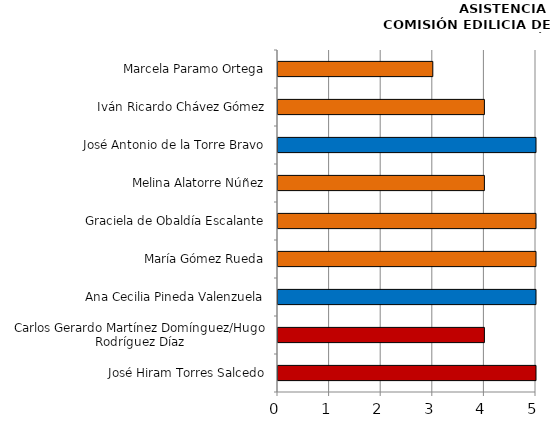
| Category | Series 0 |
|---|---|
| José Hiram Torres Salcedo | 5 |
| Carlos Gerardo Martínez Domínguez/Hugo Rodríguez Díaz | 4 |
| Ana Cecilia Pineda Valenzuela | 5 |
| María Gómez Rueda | 5 |
| Graciela de Obaldía Escalante | 5 |
| Melina Alatorre Núñez | 4 |
| José Antonio de la Torre Bravo | 5 |
| Iván Ricardo Chávez Gómez | 4 |
| Marcela Paramo Ortega | 3 |